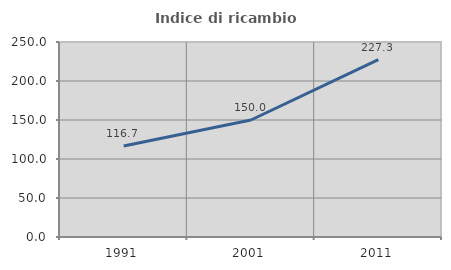
| Category | Indice di ricambio occupazionale  |
|---|---|
| 1991.0 | 116.667 |
| 2001.0 | 150 |
| 2011.0 | 227.273 |